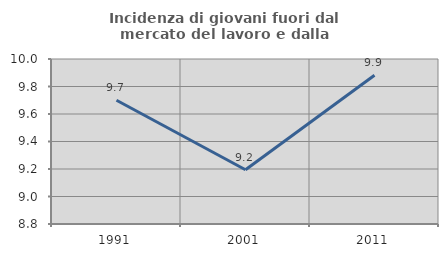
| Category | Incidenza di giovani fuori dal mercato del lavoro e dalla formazione  |
|---|---|
| 1991.0 | 9.7 |
| 2001.0 | 9.195 |
| 2011.0 | 9.882 |